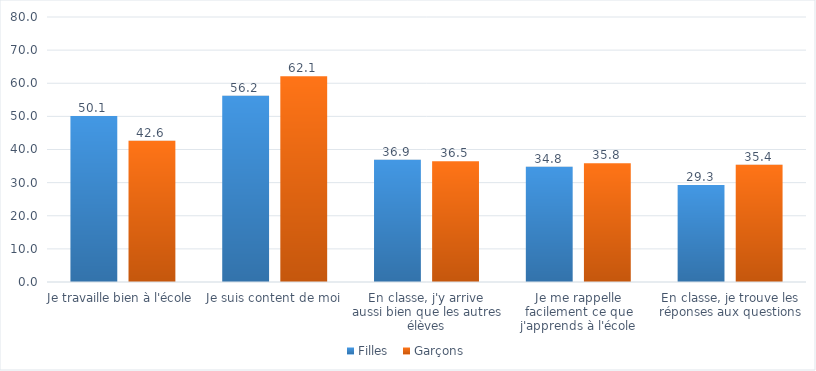
| Category | Filles  | Garçons |
|---|---|---|
| Je travaille bien à l'école | 50.1 | 42.63 |
| Je suis content de moi | 56.24 | 62.1 |
| En classe, j'y arrive aussi bien que les autres élèves | 36.89 | 36.48 |
| Je me rappelle facilement ce que j'apprends à l'école | 34.8 | 35.82 |
| En classe, je trouve les réponses aux questions | 29.27 | 35.36 |